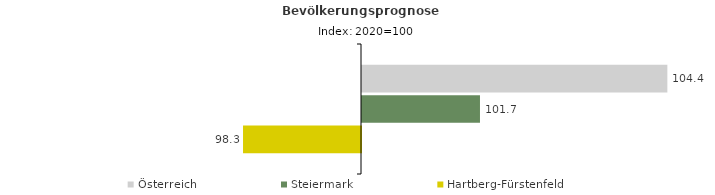
| Category | Österreich | Steiermark | Hartberg-Fürstenfeld |
|---|---|---|---|
| 2020.0 | 104.4 | 101.7 | 98.3 |